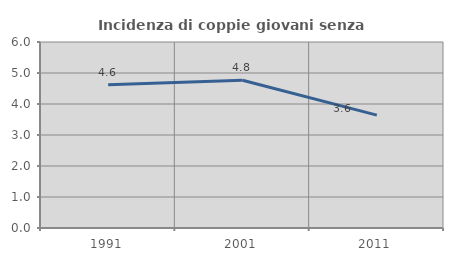
| Category | Incidenza di coppie giovani senza figli |
|---|---|
| 1991.0 | 4.62 |
| 2001.0 | 4.768 |
| 2011.0 | 3.641 |